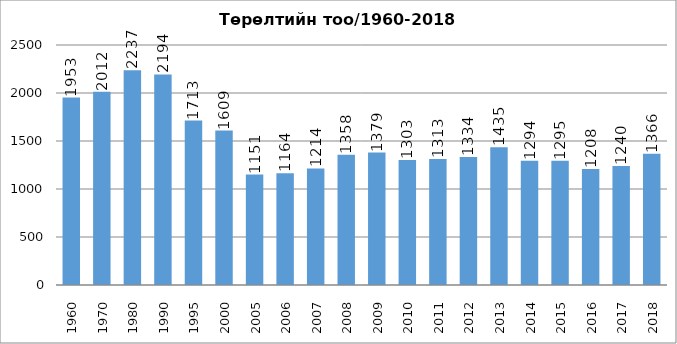
| Category | Бүгд |
|---|---|
| 1960.0 | 1953 |
| 1970.0 | 2012 |
| 1980.0 | 2237 |
| 1990.0 | 2194 |
| 1995.0 | 1713 |
| 2000.0 | 1609 |
| 2005.0 | 1151 |
| 2006.0 | 1164 |
| 2007.0 | 1214 |
| 2008.0 | 1358 |
| 2009.0 | 1379 |
| 2010.0 | 1303 |
| 2011.0 | 1313 |
| 2012.0 | 1334 |
| 2013.0 | 1435 |
| 2014.0 | 1294 |
| 2015.0 | 1295 |
| 2016.0 | 1208 |
| 2017.0 | 1240 |
| 2018.0 | 1366 |